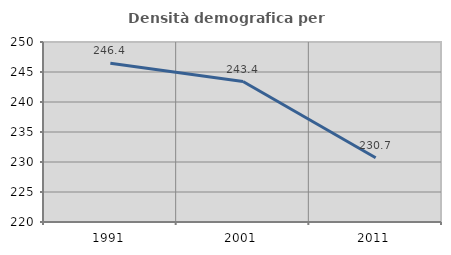
| Category | Densità demografica |
|---|---|
| 1991.0 | 246.448 |
| 2001.0 | 243.416 |
| 2011.0 | 230.702 |